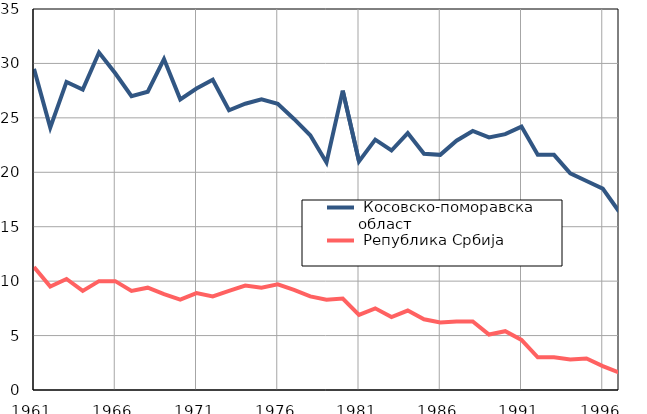
| Category |  Косовско-поморавска област |  Република Србија |
|---|---|---|
| 1961.0 | 29.5 | 11.3 |
| 1962.0 | 24.1 | 9.5 |
| 1963.0 | 28.3 | 10.2 |
| 1964.0 | 27.6 | 9.1 |
| 1965.0 | 31 | 10 |
| 1966.0 | 29.1 | 10 |
| 1967.0 | 27 | 9.1 |
| 1968.0 | 27.4 | 9.4 |
| 1969.0 | 30.4 | 8.8 |
| 1970.0 | 26.7 | 8.3 |
| 1971.0 | 27.7 | 8.9 |
| 1972.0 | 28.5 | 8.6 |
| 1973.0 | 25.7 | 9.1 |
| 1974.0 | 26.3 | 9.6 |
| 1975.0 | 26.7 | 9.4 |
| 1976.0 | 26.3 | 9.7 |
| 1977.0 | 24.9 | 9.2 |
| 1978.0 | 23.4 | 8.6 |
| 1979.0 | 20.9 | 8.3 |
| 1980.0 | 27.5 | 8.4 |
| 1981.0 | 21 | 6.9 |
| 1982.0 | 23 | 7.5 |
| 1983.0 | 22 | 6.7 |
| 1984.0 | 23.6 | 7.3 |
| 1985.0 | 21.7 | 6.5 |
| 1986.0 | 21.6 | 6.2 |
| 1987.0 | 22.9 | 6.3 |
| 1988.0 | 23.8 | 6.3 |
| 1989.0 | 23.2 | 5.1 |
| 1990.0 | 23.5 | 5.4 |
| 1991.0 | 24.2 | 4.6 |
| 1992.0 | 21.6 | 3 |
| 1993.0 | 21.6 | 3 |
| 1994.0 | 19.9 | 2.8 |
| 1995.0 | 19.2 | 2.9 |
| 1996.0 | 18.5 | 2.2 |
| 1997.0 | 16.4 | 1.6 |